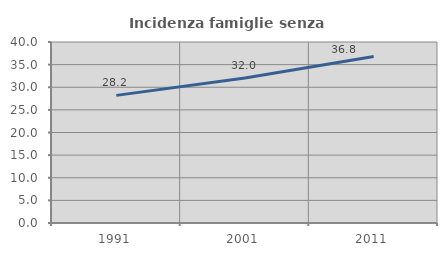
| Category | Incidenza famiglie senza nuclei |
|---|---|
| 1991.0 | 28.205 |
| 2001.0 | 32.035 |
| 2011.0 | 36.777 |